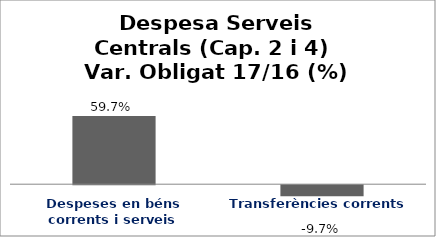
| Category | Series 0 |
|---|---|
| Despeses en béns corrents i serveis | 0.597 |
| Transferències corrents | -0.097 |